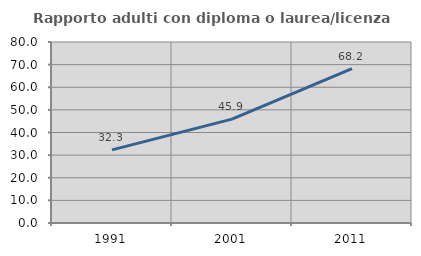
| Category | Rapporto adulti con diploma o laurea/licenza media  |
|---|---|
| 1991.0 | 32.328 |
| 2001.0 | 45.897 |
| 2011.0 | 68.182 |